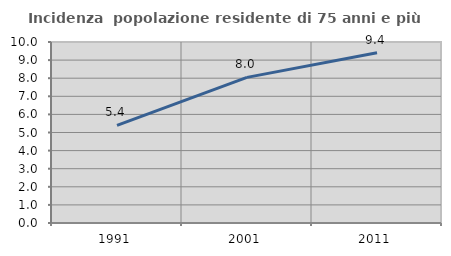
| Category | Incidenza  popolazione residente di 75 anni e più |
|---|---|
| 1991.0 | 5.391 |
| 2001.0 | 8.046 |
| 2011.0 | 9.403 |